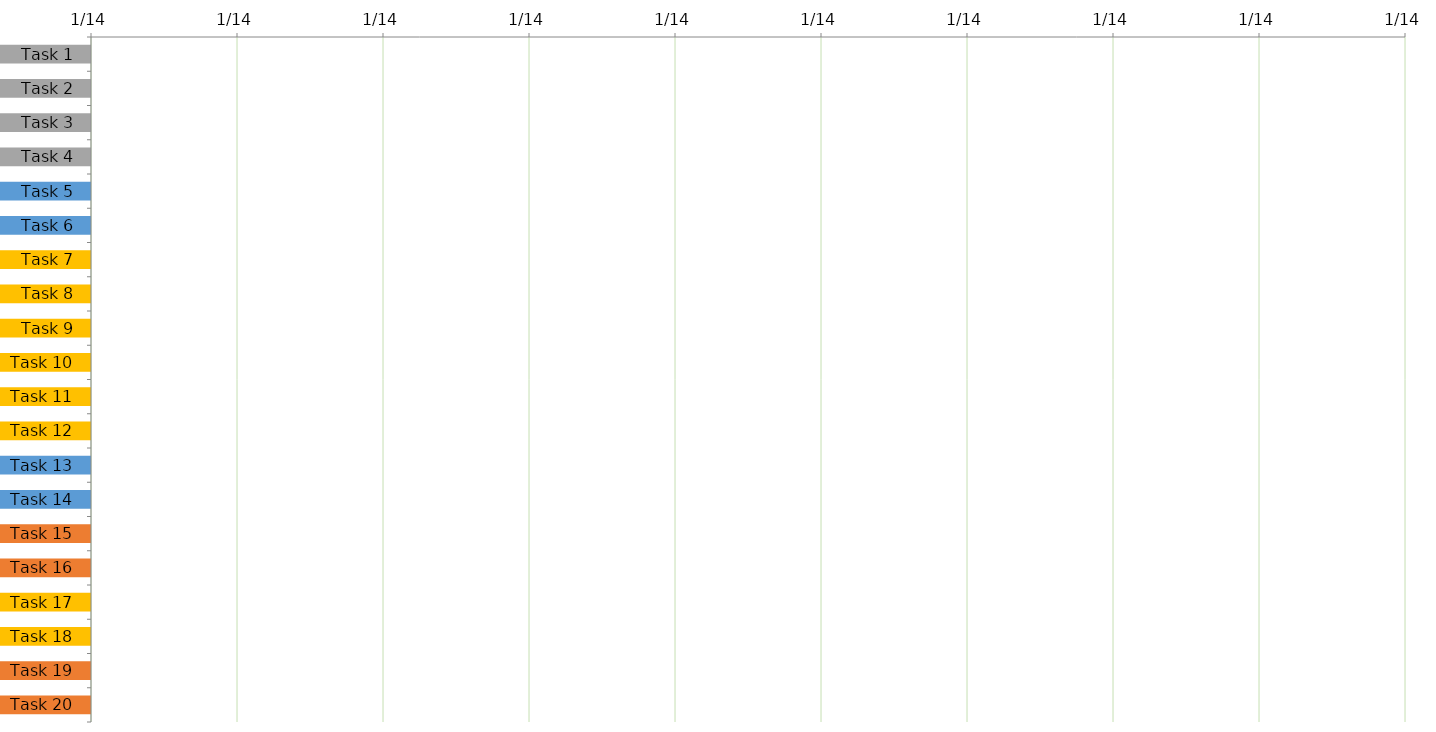
| Category | START DATE | DURATION (days) |
|---|---|---|
| Task 1 |  | 1 |
| Task 2 |  | 1 |
| Task 3 |  | 1 |
| Task 4 |  | 1 |
| Task 5 |  | 1 |
| Task 6 |  | 1 |
| Task 7 |  | 1 |
| Task 8 |  | 1 |
| Task 9 |  | 1 |
| Task 10 |  | 1 |
| Task 11 |  | 1 |
| Task 12 |  | 1 |
| Task 13 |  | 1 |
| Task 14 |  | 1 |
| Task 15 |  | 1 |
| Task 16 |  | 1 |
| Task 17 |  | 1 |
| Task 18 |  | 1 |
| Task 19 |  | 1 |
| Task 20 |  | 1 |